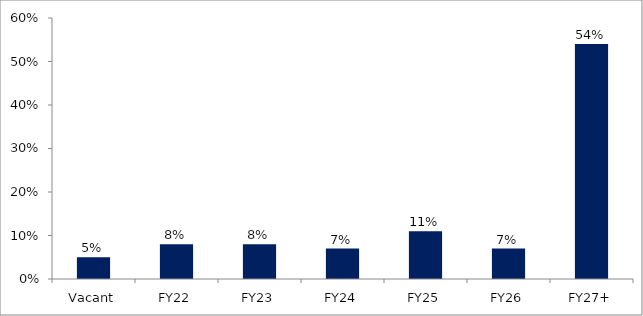
| Category | Series 0 |
|---|---|
| Vacant | 0.05 |
| FY22 | 0.08 |
| FY23 | 0.08 |
| FY24 | 0.07 |
| FY25 | 0.11 |
| FY26 | 0.07 |
| FY27+ | 0.54 |